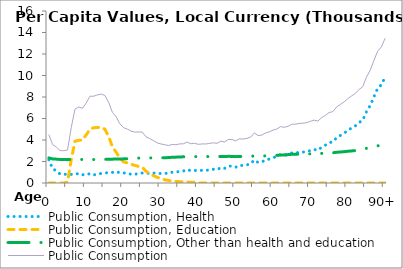
| Category | Public Consumption, Health | Public Consumption, Education | Public Consumption, Other than health and education | Public Consumption |
|---|---|---|---|---|
| 0 | 2165.274 | 0 | 2335.057 | 4500.33 |
|  | 1335.769 | 0 | 2240.92 | 3576.689 |
| 2 | 1122.211 | 0 | 2218.699 | 3340.91 |
| 3 | 830.342 | 0 | 2186.174 | 3016.516 |
| 4 | 814.357 | 0 | 2185.678 | 3000.035 |
| 5 | 803.795 | 81.662 | 2185.379 | 3070.837 |
| 6 | 798.429 | 2198.083 | 2185.257 | 5181.769 |
| 7 | 801.194 | 3885.557 | 2186.061 | 6872.812 |
| 8 | 897.642 | 3970.64 | 2200.263 | 7068.546 |
| 9 | 773.96 | 3992.329 | 2183.733 | 6950.022 |
| 10 | 774.895 | 4482.386 | 2184.842 | 7442.124 |
| 11 | 868.573 | 5002.498 | 2197.3 | 8068.371 |
| 12 | 745.424 | 5148.286 | 2180.88 | 8074.591 |
| 13 | 846.978 | 5153.925 | 2193.68 | 8194.584 |
| 14 | 880.067 | 5192.474 | 2197.207 | 8269.748 |
| 15 | 934.859 | 5004.959 | 2204.409 | 8144.227 |
| 16 | 959.08 | 4326.511 | 2208.765 | 7494.357 |
| 17 | 986.841 | 3374.334 | 2216.406 | 6577.58 |
| 18 | 1065.91 | 2861.306 | 2236.147 | 6163.362 |
| 19 | 940.847 | 2331.013 | 2230.348 | 5502.207 |
| 20 | 940.341 | 1963.1 | 2244.343 | 5147.785 |
| 21 | 882.596 | 1874.525 | 2256.273 | 5013.394 |
| 22 | 816.415 | 1745.444 | 2269.356 | 4831.215 |
| 23 | 802.581 | 1638.074 | 2290.801 | 4731.455 |
| 24 | 887.673 | 1540.575 | 2316.5 | 4744.748 |
| 25 | 929.134 | 1477.54 | 2325.841 | 4732.515 |
| 26 | 883.23 | 1086.354 | 2322.094 | 4291.677 |
| 27 | 912.561 | 884.425 | 2330.761 | 4127.747 |
| 28 | 929.351 | 681.083 | 2337.365 | 3947.8 |
| 29 | 866.547 | 526.427 | 2333.41 | 3726.384 |
| 30 | 889.924 | 398.98 | 2344.001 | 3632.906 |
| 31 | 904.979 | 304.008 | 2353.086 | 3562.073 |
| 32 | 885.445 | 235.93 | 2363.6 | 3484.975 |
| 33 | 1005.179 | 184.145 | 2393.043 | 3582.367 |
| 34 | 1008.486 | 152.406 | 2403.803 | 3564.695 |
| 35 | 1085.108 | 126.337 | 2423.242 | 3634.687 |
| 36 | 1110.374 | 105.129 | 2433.519 | 3649.021 |
| 37 | 1255.487 | 87.115 | 2458.636 | 3801.238 |
| 38 | 1133.398 | 73.646 | 2445.097 | 3652.142 |
| 39 | 1168.599 | 72.344 | 2449.897 | 3690.84 |
| 40 | 1148.617 | 0 | 2450.893 | 3599.51 |
| 41 | 1178.333 | 0 | 2455.356 | 3633.689 |
| 42 | 1176.481 | 0 | 2455.696 | 3632.177 |
| 43 | 1219.725 | 0 | 2460.119 | 3679.844 |
| 44 | 1277.262 | 0 | 2461.39 | 3738.652 |
| 45 | 1236.529 | 0 | 2452.723 | 3689.252 |
| 46 | 1421.945 | 0 | 2473.118 | 3895.062 |
| 47 | 1358.715 | 0 | 2457.143 | 3815.858 |
| 48 | 1563.973 | 0 | 2480.282 | 4044.255 |
| 49 | 1574.156 | 0 | 2472.614 | 4046.769 |
| 50 | 1470.512 | 0 | 2451.432 | 3921.944 |
| 51 | 1640.761 | 0 | 2469.308 | 4110.07 |
| 52 | 1627.076 | 0 | 2460.098 | 4087.174 |
| 53 | 1683.176 | 0 | 2464.911 | 4148.087 |
| 54 | 1790.567 | 0 | 2475.627 | 4266.194 |
| 55 | 2139.1 | 0 | 2519.005 | 4658.105 |
| 56 | 1913.083 | 0 | 2490.173 | 4403.256 |
| 57 | 1960.744 | 0 | 2498.685 | 4459.43 |
| 58 | 2132.575 | 0 | 2523.059 | 4655.634 |
| 59 | 2228.754 | 0 | 2533.694 | 4762.448 |
| 60 | 2364.319 | 0 | 2550.408 | 4914.727 |
| 61 | 2451.944 | 0 | 2569.58 | 5021.524 |
| 62 | 2635.686 | 0 | 2609.665 | 5245.35 |
| 63 | 2566.906 | 0 | 2614.903 | 5181.809 |
| 64 | 2631.644 | 0 | 2640.188 | 5271.832 |
| 65 | 2795.018 | 0 | 2668.688 | 5463.706 |
| 66 | 2797.036 | 0 | 2676.593 | 5473.629 |
| 67 | 2855.167 | 0 | 2688.982 | 5544.149 |
| 68 | 2872.237 | 0 | 2694.391 | 5566.628 |
| 69 | 2912.968 | 0 | 2696.51 | 5609.479 |
| 70 | 3020.619 | 0 | 2713.44 | 5734.06 |
| 71 | 3122.789 | 0 | 2725.97 | 5848.759 |
| 72 | 3041.579 | 0 | 2717.748 | 5759.326 |
| 73 | 3328.632 | 0 | 2752.25 | 6080.882 |
| 74 | 3514.04 | 0 | 2777.823 | 6291.863 |
| 75 | 3744.384 | 0 | 2805.934 | 6550.318 |
| 76 | 3829.614 | 0 | 2812.495 | 6642.108 |
| 77 | 4212.326 | 0 | 2861.429 | 7073.756 |
| 78 | 4419.232 | 0 | 2881.94 | 7301.172 |
| 79 | 4630.162 | 0 | 2911.647 | 7541.809 |
| 80 | 4890.837 | 0 | 2953.634 | 7844.47 |
| 81 | 5117.785 | 0 | 2982.348 | 8100.132 |
| 82 | 5305.428 | 0 | 3015.537 | 8320.965 |
| 83 | 5619.269 | 0 | 3073.349 | 8692.618 |
| 84 | 5839.824 | 0 | 3114.614 | 8954.439 |
| 85 | 6625.585 | 0 | 3224.482 | 9850.068 |
| 86 | 7197.533 | 0 | 3285.16 | 10482.693 |
| 87 | 8011.791 | 0 | 3383.872 | 11395.663 |
| 88 | 8801.437 | 0 | 3461.145 | 12262.582 |
| 89 | 9144.781 | 0 | 3509.564 | 12654.345 |
| 90+ | 9852.073 | 0 | 3613.063 | 13465.136 |